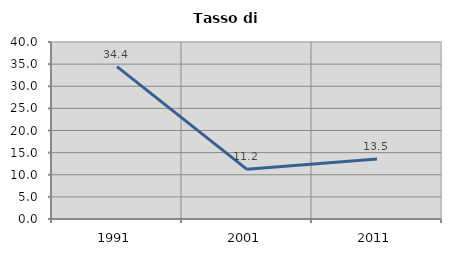
| Category | Tasso di disoccupazione   |
|---|---|
| 1991.0 | 34.419 |
| 2001.0 | 11.221 |
| 2011.0 | 13.542 |